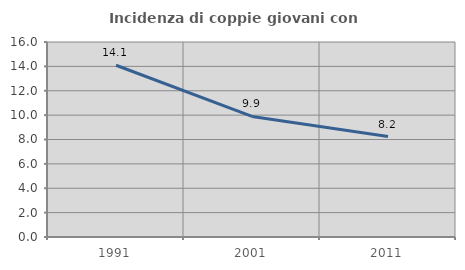
| Category | Incidenza di coppie giovani con figli |
|---|---|
| 1991.0 | 14.091 |
| 2001.0 | 9.892 |
| 2011.0 | 8.243 |